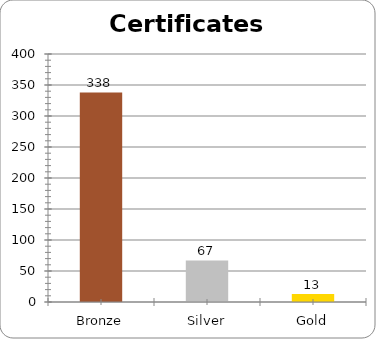
| Category | Series 0 |
|---|---|
| Bronze | 338 |
| Silver | 67 |
| Gold | 13 |